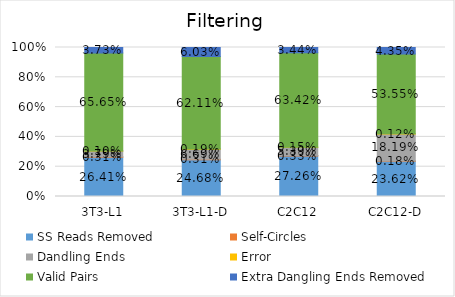
| Category | SS Reads Removed | Self-Circles | Dandling Ends | Error | Valid Pairs | Extra Dangling Ends Removed |
|---|---|---|---|---|---|---|
| 3T3-L1 | 0.264 | 0.003 | 0.038 | 0.001 | 0.657 | 0.037 |
| 3T3-L1-D | 0.247 | 0.003 | 0.067 | 0.002 | 0.621 | 0.06 |
| C2C12 | 0.273 | 0.003 | 0.054 | 0.002 | 0.634 | 0.034 |
| C2C12-D | 0.236 | 0.002 | 0.182 | 0.001 | 0.535 | 0.043 |